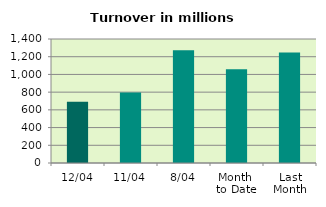
| Category | Series 0 |
|---|---|
| 12/04 | 691.64 |
| 11/04 | 794.579 |
| 8/04 | 1273.917 |
| Month 
to Date | 1059.778 |
| Last
Month | 1246.474 |